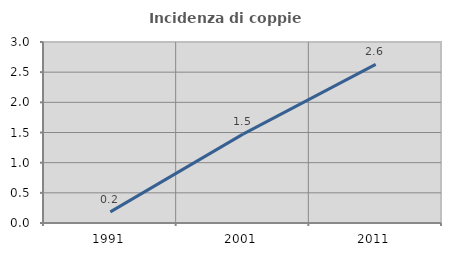
| Category | Incidenza di coppie miste |
|---|---|
| 1991.0 | 0.185 |
| 2001.0 | 1.473 |
| 2011.0 | 2.628 |